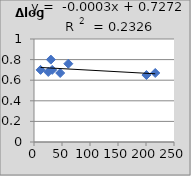
| Category | Δlog K |
|---|---|
| 25.5 | 0.68 |
| 61.3 | 0.76 |
| 11.7 | 0.7 |
| 216.5 | 0.67 |
| 46.8 | 0.67 |
| 32.5 | 0.7 |
| 200.8 | 0.65 |
| 30.1 | 0.8 |